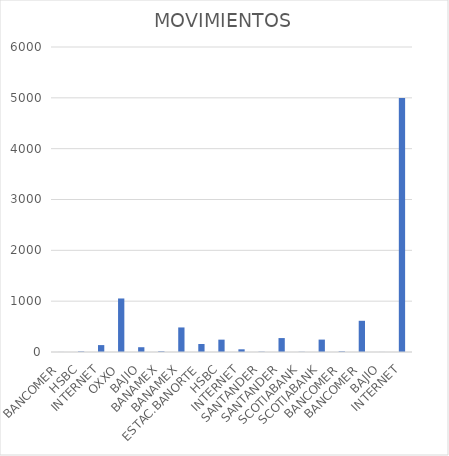
| Category | MOVIMIENTOS |
|---|---|
| BANCOMER | 1 |
| HSBC | 10 |
| INTERNET | 136 |
| OXXO | 1053 |
| BAJIO | 94 |
| BANAMEX | 13 |
| BANAMEX | 483 |
| ESTAC.BANORTE | 157 |
| HSBC | 243 |
| INTERNET | 53 |
| SANTANDER | 6 |
| SANTANDER | 274 |
| SCOTIABANK | 4 |
| SCOTIABANK | 244 |
| BANCOMER | 12 |
| BANCOMER | 614 |
| BAJIO | 1 |
| INTERNET | 4999 |